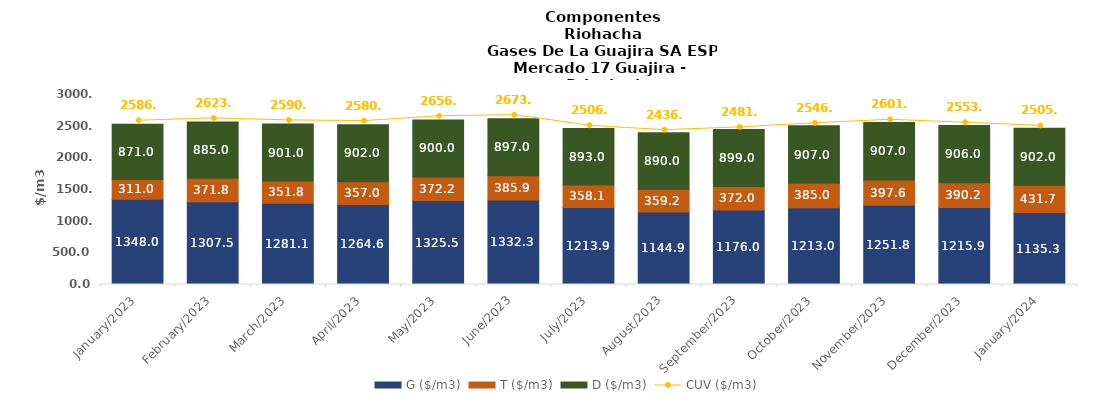
| Category | G ($/m3) | T ($/m3) | D ($/m3) |
|---|---|---|---|
| 2023-01-01 | 1348 | 310.95 | 871 |
| 2023-02-01 | 1307.53 | 371.84 | 885 |
| 2023-03-01 | 1281.1 | 351.77 | 901 |
| 2023-04-01 | 1264.63 | 356.99 | 902 |
| 2023-05-01 | 1325.54 | 372.19 | 900 |
| 2023-06-01 | 1332.29 | 385.86 | 897 |
| 2023-07-01 | 1213.88 | 358.06 | 893 |
| 2023-08-01 | 1144.92 | 359.17 | 890 |
| 2023-09-01 | 1176 | 372 | 899 |
| 2023-10-01 | 1213 | 385 | 907 |
| 2023-11-01 | 1251.77 | 397.64 | 907 |
| 2023-12-01 | 1215.86 | 390.2 | 906 |
| 2024-01-01 | 1135.29 | 431.72 | 902 |